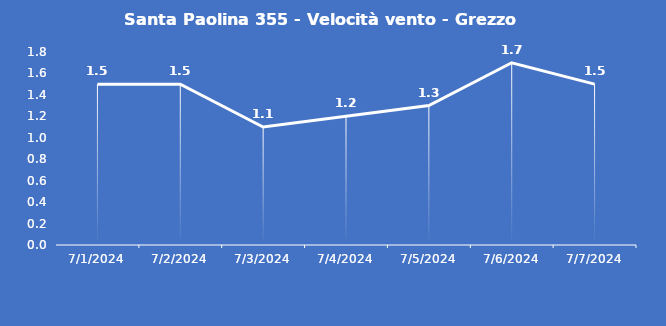
| Category | Santa Paolina 355 - Velocità vento - Grezzo (m/s) |
|---|---|
| 7/1/24 | 1.5 |
| 7/2/24 | 1.5 |
| 7/3/24 | 1.1 |
| 7/4/24 | 1.2 |
| 7/5/24 | 1.3 |
| 7/6/24 | 1.7 |
| 7/7/24 | 1.5 |